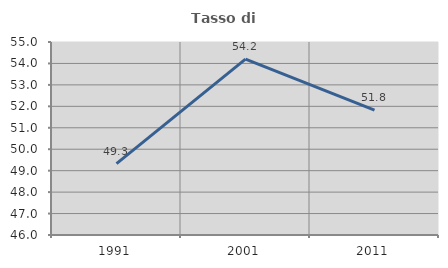
| Category | Tasso di occupazione   |
|---|---|
| 1991.0 | 49.326 |
| 2001.0 | 54.203 |
| 2011.0 | 51.821 |